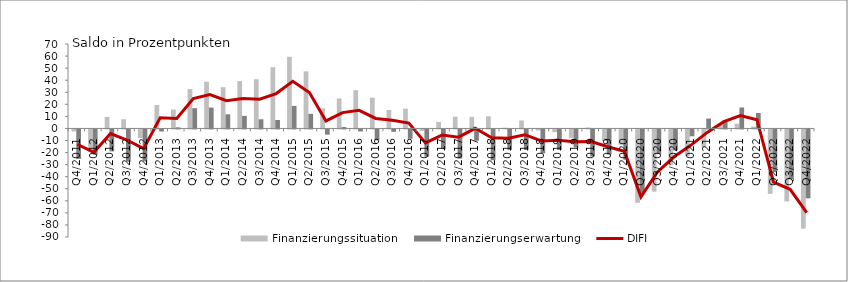
| Category | Finanzierungssituation | Finanzierungserwartung |
|---|---|---|
| Q4/2011 | -1.7 | -24.4 |
| Q1/2012 | -18.4 | -21.1 |
| Q2/2012 | 9.6 | -18.2 |
| Q3/2012 | 7.6 | -26.7 |
| Q4/2012 | -7.1 | -26.5 |
| Q1/2013 | 19.4 | -1.7 |
| Q2/2013 | 15.7 | 0.9 |
| Q3/2013 | 32.7 | 16.8 |
| Q4/2013 | 38.7 | 17.3 |
| Q1/2014 | 34.2 | 11.7 |
| Q2/2014 | 39.3 | 10.4 |
| Q3/2014 | 40.8 | 7.6 |
| Q4/2014 | 50.8 | 7 |
| Q1/2015 | 59.4 | 18.7 |
| Q2/2015 | 47.3 | 12.1 |
| Q3/2015 | 16.7 | -4.3 |
| Q4/2015 | 24.9 | 1.2 |
| Q1/2016 | 31.7 | -1.7 |
| Q2/2016 | 25.5 | -9 |
| Q3/2016 | 15.3 | -2 |
| Q4/2016 | 16.4 | -7.7 |
| Q1/2017 | -1.3 | -22.6 |
| Q2/2017 | 5.4 | -16.3 |
| Q3/2017 | 9.8 | -24.1 |
| Q4/2017 | 9.6 | -9.4 |
| Q1/2018 | 10.1 | -25.6 |
| Q2/2018 | 0.6 | -16.9 |
| Q3/2018 | 6.6 | -17 |
| Q4/2018 | -0.9 | -19.8 |
| Q1/2019 | -2.3 | -17 |
| Q2/2019 | -7.2 | -14.9 |
| Q3/2019 | 0.8 | -22.4 |
| Q4/2019 | -9.6 | -20.8 |
| Q1/2020 | -12.6 | -25.1 |
| Q2/2020 | -60.8 | -52.6 |
| Q3/2020 | -51.6 | -20.4 |
| Q4/2020 | -29.6 | -17.4 |
| Q1/2021 | -22.2 | -5.7 |
| Q2/2021 | -14.8 | 8.2 |
| Q3/2021 | 4.3 | 6.8 |
| Q4/2021 | 4 | 17.4 |
| Q1/2022 | 1.6 | 12.8 |
| Q2/2022 | -53.4 | -35.5 |
| Q3/2022 | -59.7 | -41.2 |
| Q4/2022 | -82.3 | -57.1 |